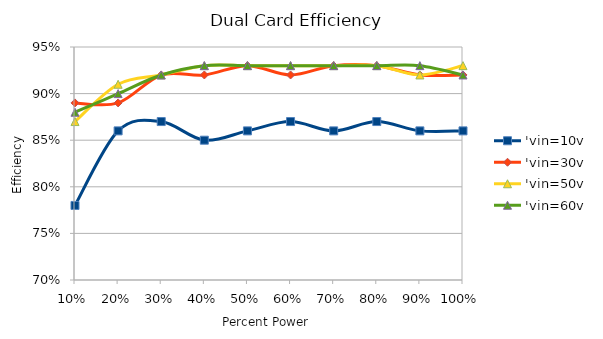
| Category | 'vin=10v | 'vin=30v | 'vin=50v | 'vin=60v |
|---|---|---|---|---|
| 0 | 0.78 | 0.89 | 0.87 | 0.88 |
| 1 | 0.86 | 0.89 | 0.91 | 0.9 |
| 2 | 0.87 | 0.92 | 0.92 | 0.92 |
| 3 | 0.85 | 0.92 | 0.93 | 0.93 |
| 4 | 0.86 | 0.93 | 0.93 | 0.93 |
| 5 | 0.87 | 0.92 | 0.93 | 0.93 |
| 6 | 0.86 | 0.93 | 0.93 | 0.93 |
| 7 | 0.87 | 0.93 | 0.93 | 0.93 |
| 8 | 0.86 | 0.92 | 0.92 | 0.93 |
| 9 | 0.86 | 0.92 | 0.93 | 0.92 |